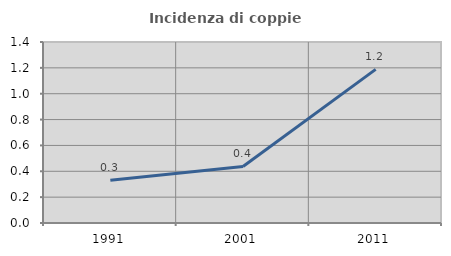
| Category | Incidenza di coppie miste |
|---|---|
| 1991.0 | 0.331 |
| 2001.0 | 0.437 |
| 2011.0 | 1.188 |